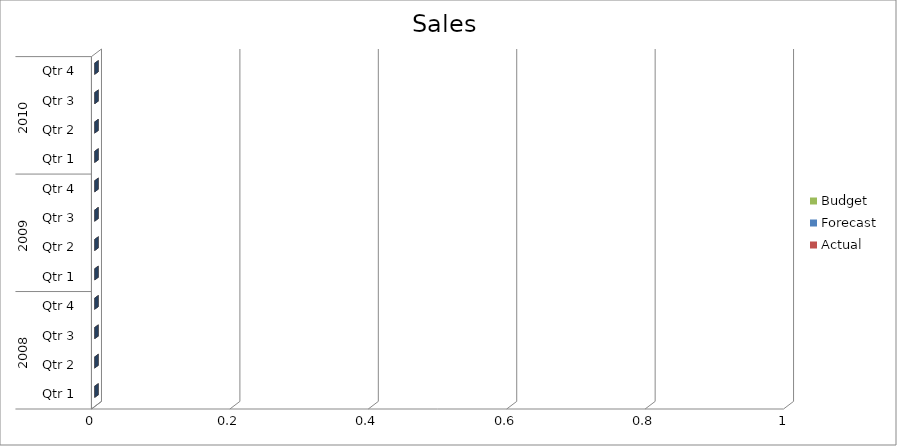
| Category | Budget | Forecast | Actual |
|---|---|---|---|
| 0 | 820 | 3140 | 880 |
| 1 | 2680 | 1960 | 3410 |
| 2 | 1920 | 1100 | 870 |
| 3 | 1090 | 1160 | 2910 |
| 4 | 850 | 3480 | 1110 |
| 5 | 3110 | 2440 | 720 |
| 6 | 1780 | 3400 | 1440 |
| 7 | 3240 | 680 | 2080 |
| 8 | 3170 | 1510 | 900 |
| 9 | 3460 | 1930 | 660 |
| 10 | 1470 | 1200 | 2830 |
| 11 | 1750 | 2500 | 720 |